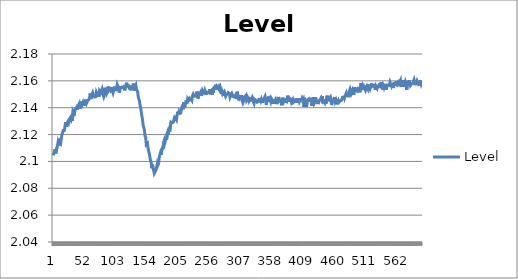
| Category | Level |
|---|---|
| 0 | 2.104 |
| 1 | 2.106 |
| 2 | 2.106 |
| 3 | 2.109 |
| 4 | 2.106 |
| 5 | 2.106 |
| 6 | 2.11 |
| 7 | 2.112 |
| 8 | 2.115 |
| 9 | 2.114 |
| 10 | 2.112 |
| 11 | 2.115 |
| 12 | 2.114 |
| 13 | 2.117 |
| 14 | 2.12 |
| 15 | 2.119 |
| 16 | 2.123 |
| 17 | 2.123 |
| 18 | 2.123 |
| 19 | 2.123 |
| 20 | 2.129 |
| 21 | 2.126 |
| 22 | 2.128 |
| 23 | 2.128 |
| 24 | 2.13 |
| 25 | 2.129 |
| 26 | 2.131 |
| 27 | 2.132 |
| 28 | 2.133 |
| 29 | 2.132 |
| 30 | 2.134 |
| 31 | 2.13 |
| 32 | 2.137 |
| 33 | 2.136 |
| 34 | 2.134 |
| 35 | 2.138 |
| 36 | 2.138 |
| 37 | 2.14 |
| 38 | 2.14 |
| 39 | 2.138 |
| 40 | 2.141 |
| 41 | 2.14 |
| 42 | 2.143 |
| 43 | 2.139 |
| 44 | 2.141 |
| 45 | 2.142 |
| 46 | 2.145 |
| 47 | 2.142 |
| 48 | 2.144 |
| 49 | 2.142 |
| 50 | 2.145 |
| 51 | 2.142 |
| 52 | 2.146 |
| 53 | 2.146 |
| 54 | 2.143 |
| 55 | 2.144 |
| 56 | 2.146 |
| 57 | 2.146 |
| 58 | 2.146 |
| 59 | 2.148 |
| 60 | 2.151 |
| 61 | 2.146 |
| 62 | 2.149 |
| 63 | 2.149 |
| 64 | 2.151 |
| 65 | 2.149 |
| 66 | 2.15 |
| 67 | 2.148 |
| 68 | 2.148 |
| 69 | 2.148 |
| 70 | 2.152 |
| 71 | 2.151 |
| 72 | 2.148 |
| 73 | 2.151 |
| 74 | 2.148 |
| 75 | 2.153 |
| 76 | 2.153 |
| 77 | 2.151 |
| 78 | 2.152 |
| 79 | 2.154 |
| 80 | 2.151 |
| 81 | 2.152 |
| 82 | 2.148 |
| 83 | 2.15 |
| 84 | 2.155 |
| 85 | 2.151 |
| 86 | 2.154 |
| 87 | 2.151 |
| 88 | 2.152 |
| 89 | 2.156 |
| 90 | 2.153 |
| 91 | 2.154 |
| 92 | 2.155 |
| 93 | 2.153 |
| 94 | 2.154 |
| 95 | 2.155 |
| 96 | 2.153 |
| 97 | 2.151 |
| 98 | 2.153 |
| 99 | 2.156 |
| 100 | 2.156 |
| 101 | 2.152 |
| 102 | 2.154 |
| 103 | 2.153 |
| 104 | 2.157 |
| 105 | 2.156 |
| 106 | 2.155 |
| 107 | 2.151 |
| 108 | 2.153 |
| 109 | 2.156 |
| 110 | 2.155 |
| 111 | 2.155 |
| 112 | 2.155 |
| 113 | 2.155 |
| 114 | 2.156 |
| 115 | 2.156 |
| 116 | 2.153 |
| 117 | 2.155 |
| 118 | 2.156 |
| 119 | 2.159 |
| 120 | 2.156 |
| 121 | 2.156 |
| 122 | 2.156 |
| 123 | 2.156 |
| 124 | 2.154 |
| 125 | 2.156 |
| 126 | 2.153 |
| 127 | 2.156 |
| 128 | 2.156 |
| 129 | 2.156 |
| 130 | 2.158 |
| 131 | 2.153 |
| 132 | 2.154 |
| 133 | 2.156 |
| 134 | 2.157 |
| 135 | 2.154 |
| 136 | 2.153 |
| 137 | 2.152 |
| 138 | 2.148 |
| 139 | 2.147 |
| 140 | 2.145 |
| 141 | 2.142 |
| 142 | 2.14 |
| 143 | 2.136 |
| 144 | 2.136 |
| 145 | 2.131 |
| 146 | 2.127 |
| 147 | 2.125 |
| 148 | 2.123 |
| 149 | 2.119 |
| 150 | 2.118 |
| 151 | 2.112 |
| 152 | 2.113 |
| 153 | 2.113 |
| 154 | 2.11 |
| 155 | 2.107 |
| 156 | 2.106 |
| 157 | 2.106 |
| 158 | 2.1 |
| 159 | 2.099 |
| 160 | 2.095 |
| 161 | 2.098 |
| 162 | 2.095 |
| 163 | 2.093 |
| 164 | 2.091 |
| 165 | 2.092 |
| 166 | 2.093 |
| 167 | 2.094 |
| 168 | 2.094 |
| 169 | 2.098 |
| 170 | 2.097 |
| 171 | 2.098 |
| 172 | 2.103 |
| 173 | 2.103 |
| 174 | 2.106 |
| 175 | 2.105 |
| 176 | 2.108 |
| 177 | 2.109 |
| 178 | 2.111 |
| 179 | 2.11 |
| 180 | 2.115 |
| 181 | 2.117 |
| 182 | 2.116 |
| 183 | 2.118 |
| 184 | 2.116 |
| 185 | 2.121 |
| 186 | 2.122 |
| 187 | 2.12 |
| 188 | 2.124 |
| 189 | 2.122 |
| 190 | 2.127 |
| 191 | 2.129 |
| 192 | 2.129 |
| 193 | 2.129 |
| 194 | 2.13 |
| 195 | 2.129 |
| 196 | 2.131 |
| 197 | 2.133 |
| 198 | 2.133 |
| 199 | 2.132 |
| 200 | 2.131 |
| 201 | 2.134 |
| 202 | 2.137 |
| 203 | 2.135 |
| 204 | 2.137 |
| 205 | 2.136 |
| 206 | 2.136 |
| 207 | 2.136 |
| 208 | 2.139 |
| 209 | 2.138 |
| 210 | 2.142 |
| 211 | 2.139 |
| 212 | 2.144 |
| 213 | 2.14 |
| 214 | 2.142 |
| 215 | 2.141 |
| 216 | 2.146 |
| 217 | 2.143 |
| 218 | 2.146 |
| 219 | 2.145 |
| 220 | 2.145 |
| 221 | 2.147 |
| 222 | 2.146 |
| 223 | 2.146 |
| 224 | 2.146 |
| 225 | 2.146 |
| 226 | 2.149 |
| 227 | 2.15 |
| 228 | 2.148 |
| 229 | 2.149 |
| 230 | 2.149 |
| 231 | 2.148 |
| 232 | 2.15 |
| 233 | 2.152 |
| 234 | 2.15 |
| 235 | 2.147 |
| 236 | 2.152 |
| 237 | 2.15 |
| 238 | 2.15 |
| 239 | 2.151 |
| 240 | 2.149 |
| 241 | 2.151 |
| 242 | 2.153 |
| 243 | 2.152 |
| 244 | 2.153 |
| 245 | 2.151 |
| 246 | 2.153 |
| 247 | 2.153 |
| 248 | 2.15 |
| 249 | 2.152 |
| 250 | 2.152 |
| 251 | 2.151 |
| 252 | 2.152 |
| 253 | 2.151 |
| 254 | 2.154 |
| 255 | 2.152 |
| 256 | 2.152 |
| 257 | 2.153 |
| 258 | 2.15 |
| 259 | 2.154 |
| 260 | 2.151 |
| 261 | 2.155 |
| 262 | 2.155 |
| 263 | 2.156 |
| 264 | 2.157 |
| 265 | 2.153 |
| 266 | 2.156 |
| 267 | 2.156 |
| 268 | 2.154 |
| 269 | 2.156 |
| 270 | 2.154 |
| 271 | 2.155 |
| 272 | 2.153 |
| 273 | 2.15 |
| 274 | 2.152 |
| 275 | 2.15 |
| 276 | 2.151 |
| 277 | 2.152 |
| 278 | 2.149 |
| 279 | 2.15 |
| 280 | 2.148 |
| 281 | 2.149 |
| 282 | 2.149 |
| 283 | 2.15 |
| 284 | 2.151 |
| 285 | 2.151 |
| 286 | 2.151 |
| 287 | 2.148 |
| 288 | 2.147 |
| 289 | 2.15 |
| 290 | 2.151 |
| 291 | 2.151 |
| 292 | 2.148 |
| 293 | 2.148 |
| 294 | 2.148 |
| 295 | 2.148 |
| 296 | 2.15 |
| 297 | 2.148 |
| 298 | 2.146 |
| 299 | 2.152 |
| 300 | 2.148 |
| 301 | 2.146 |
| 302 | 2.149 |
| 303 | 2.147 |
| 304 | 2.147 |
| 305 | 2.148 |
| 306 | 2.149 |
| 307 | 2.145 |
| 308 | 2.144 |
| 309 | 2.144 |
| 310 | 2.146 |
| 311 | 2.148 |
| 312 | 2.148 |
| 313 | 2.149 |
| 314 | 2.146 |
| 315 | 2.146 |
| 316 | 2.148 |
| 317 | 2.147 |
| 318 | 2.145 |
| 319 | 2.146 |
| 320 | 2.148 |
| 321 | 2.145 |
| 322 | 2.147 |
| 323 | 2.148 |
| 324 | 2.148 |
| 325 | 2.144 |
| 326 | 2.143 |
| 327 | 2.146 |
| 328 | 2.147 |
| 329 | 2.146 |
| 330 | 2.145 |
| 331 | 2.144 |
| 332 | 2.144 |
| 333 | 2.144 |
| 334 | 2.146 |
| 335 | 2.146 |
| 336 | 2.146 |
| 337 | 2.145 |
| 338 | 2.146 |
| 339 | 2.145 |
| 340 | 2.144 |
| 341 | 2.147 |
| 342 | 2.145 |
| 343 | 2.147 |
| 344 | 2.148 |
| 345 | 2.146 |
| 346 | 2.142 |
| 347 | 2.146 |
| 348 | 2.146 |
| 349 | 2.147 |
| 350 | 2.148 |
| 351 | 2.144 |
| 352 | 2.146 |
| 353 | 2.145 |
| 354 | 2.147 |
| 355 | 2.146 |
| 356 | 2.146 |
| 357 | 2.143 |
| 358 | 2.146 |
| 359 | 2.143 |
| 360 | 2.145 |
| 361 | 2.146 |
| 362 | 2.146 |
| 363 | 2.143 |
| 364 | 2.145 |
| 365 | 2.146 |
| 366 | 2.148 |
| 367 | 2.144 |
| 368 | 2.146 |
| 369 | 2.146 |
| 370 | 2.144 |
| 371 | 2.142 |
| 372 | 2.147 |
| 373 | 2.146 |
| 374 | 2.145 |
| 375 | 2.147 |
| 376 | 2.144 |
| 377 | 2.146 |
| 378 | 2.145 |
| 379 | 2.145 |
| 380 | 2.145 |
| 381 | 2.149 |
| 382 | 2.145 |
| 383 | 2.145 |
| 384 | 2.148 |
| 385 | 2.145 |
| 386 | 2.147 |
| 387 | 2.144 |
| 388 | 2.144 |
| 389 | 2.146 |
| 390 | 2.144 |
| 391 | 2.144 |
| 392 | 2.145 |
| 393 | 2.147 |
| 394 | 2.145 |
| 395 | 2.147 |
| 396 | 2.144 |
| 397 | 2.146 |
| 398 | 2.145 |
| 399 | 2.147 |
| 400 | 2.145 |
| 401 | 2.146 |
| 402 | 2.147 |
| 403 | 2.145 |
| 404 | 2.147 |
| 405 | 2.145 |
| 406 | 2.146 |
| 407 | 2.141 |
| 408 | 2.147 |
| 409 | 2.144 |
| 410 | 2.146 |
| 411 | 2.14 |
| 412 | 2.143 |
| 413 | 2.146 |
| 414 | 2.146 |
| 415 | 2.146 |
| 416 | 2.144 |
| 417 | 2.146 |
| 418 | 2.146 |
| 419 | 2.146 |
| 420 | 2.141 |
| 421 | 2.145 |
| 422 | 2.143 |
| 423 | 2.148 |
| 424 | 2.143 |
| 425 | 2.144 |
| 426 | 2.148 |
| 427 | 2.144 |
| 428 | 2.145 |
| 429 | 2.145 |
| 430 | 2.143 |
| 431 | 2.144 |
| 432 | 2.145 |
| 433 | 2.146 |
| 434 | 2.146 |
| 435 | 2.147 |
| 436 | 2.146 |
| 437 | 2.149 |
| 438 | 2.143 |
| 439 | 2.146 |
| 440 | 2.145 |
| 441 | 2.144 |
| 442 | 2.146 |
| 443 | 2.143 |
| 444 | 2.147 |
| 445 | 2.149 |
| 446 | 2.145 |
| 447 | 2.145 |
| 448 | 2.147 |
| 449 | 2.147 |
| 450 | 2.148 |
| 451 | 2.146 |
| 452 | 2.142 |
| 453 | 2.144 |
| 454 | 2.146 |
| 455 | 2.146 |
| 456 | 2.146 |
| 457 | 2.148 |
| 458 | 2.145 |
| 459 | 2.146 |
| 460 | 2.146 |
| 461 | 2.142 |
| 462 | 2.144 |
| 463 | 2.145 |
| 464 | 2.144 |
| 465 | 2.144 |
| 466 | 2.145 |
| 467 | 2.145 |
| 468 | 2.146 |
| 469 | 2.146 |
| 470 | 2.148 |
| 471 | 2.146 |
| 472 | 2.149 |
| 473 | 2.147 |
| 474 | 2.149 |
| 475 | 2.148 |
| 476 | 2.151 |
| 477 | 2.151 |
| 478 | 2.148 |
| 479 | 2.151 |
| 480 | 2.148 |
| 481 | 2.153 |
| 482 | 2.154 |
| 483 | 2.154 |
| 484 | 2.151 |
| 485 | 2.152 |
| 486 | 2.153 |
| 487 | 2.152 |
| 488 | 2.15 |
| 489 | 2.154 |
| 490 | 2.155 |
| 491 | 2.152 |
| 492 | 2.153 |
| 493 | 2.152 |
| 494 | 2.152 |
| 495 | 2.154 |
| 496 | 2.156 |
| 497 | 2.153 |
| 498 | 2.152 |
| 499 | 2.152 |
| 500 | 2.158 |
| 501 | 2.155 |
| 502 | 2.156 |
| 503 | 2.156 |
| 504 | 2.153 |
| 505 | 2.155 |
| 506 | 2.155 |
| 507 | 2.153 |
| 508 | 2.155 |
| 509 | 2.156 |
| 510 | 2.154 |
| 511 | 2.154 |
| 512 | 2.156 |
| 513 | 2.156 |
| 514 | 2.156 |
| 515 | 2.155 |
| 516 | 2.156 |
| 517 | 2.158 |
| 518 | 2.156 |
| 519 | 2.157 |
| 520 | 2.157 |
| 521 | 2.155 |
| 522 | 2.157 |
| 523 | 2.154 |
| 524 | 2.156 |
| 525 | 2.156 |
| 526 | 2.154 |
| 527 | 2.156 |
| 528 | 2.156 |
| 529 | 2.157 |
| 530 | 2.156 |
| 531 | 2.155 |
| 532 | 2.155 |
| 533 | 2.159 |
| 534 | 2.157 |
| 535 | 2.154 |
| 536 | 2.156 |
| 537 | 2.155 |
| 538 | 2.157 |
| 539 | 2.157 |
| 540 | 2.156 |
| 541 | 2.154 |
| 542 | 2.157 |
| 543 | 2.157 |
| 544 | 2.157 |
| 545 | 2.156 |
| 546 | 2.157 |
| 547 | 2.159 |
| 548 | 2.158 |
| 549 | 2.156 |
| 550 | 2.158 |
| 551 | 2.156 |
| 552 | 2.155 |
| 553 | 2.158 |
| 554 | 2.158 |
| 555 | 2.158 |
| 556 | 2.157 |
| 557 | 2.156 |
| 558 | 2.157 |
| 559 | 2.159 |
| 560 | 2.159 |
| 561 | 2.16 |
| 562 | 2.158 |
| 563 | 2.158 |
| 564 | 2.16 |
| 565 | 2.157 |
| 566 | 2.156 |
| 567 | 2.156 |
| 568 | 2.16 |
| 569 | 2.159 |
| 570 | 2.156 |
| 571 | 2.156 |
| 572 | 2.159 |
| 573 | 2.158 |
| 574 | 2.153 |
| 575 | 2.157 |
| 576 | 2.16 |
| 577 | 2.156 |
| 578 | 2.16 |
| 579 | 2.16 |
| 580 | 2.156 |
| 581 | 2.157 |
| 582 | 2.158 |
| 583 | 2.158 |
| 584 | 2.158 |
| 585 | 2.158 |
| 586 | 2.161 |
| 587 | 2.159 |
| 588 | 2.157 |
| 589 | 2.16 |
| 590 | 2.158 |
| 591 | 2.16 |
| 592 | 2.159 |
| 593 | 2.158 |
| 594 | 2.157 |
| 595 | 2.158 |
| 596 | 2.156 |
| 597 | 2.16 |
| 598 | 2.158 |
| 599 | 2.158 |
| 600 | 2.158 |